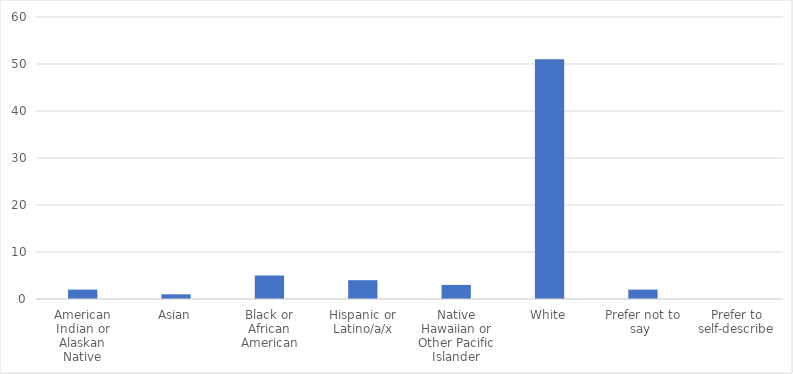
| Category | Number of Responses |
|---|---|
| American Indian or Alaskan Native | 2 |
| Asian | 1 |
| Black or African American | 5 |
| Hispanic or Latino/a/x | 4 |
| Native Hawaiian or Other Pacific Islander | 3 |
| White | 51 |
| Prefer not to say  | 2 |
| Prefer to self-describe | 0 |